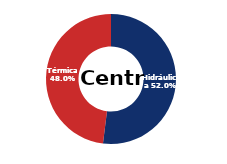
| Category | Centro |
|---|---|
| Eólica | 0 |
| Hidráulica | 2025.071 |
| Solar | 0.006 |
| Térmica | 1871.255 |